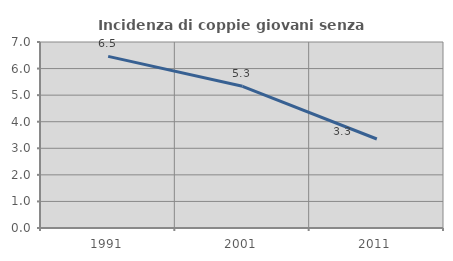
| Category | Incidenza di coppie giovani senza figli |
|---|---|
| 1991.0 | 6.46 |
| 2001.0 | 5.332 |
| 2011.0 | 3.35 |